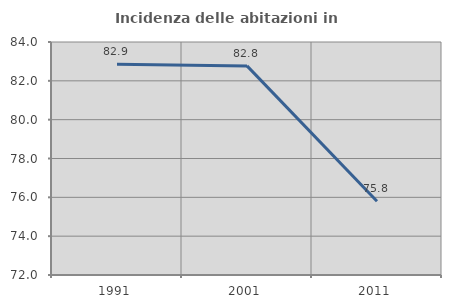
| Category | Incidenza delle abitazioni in proprietà  |
|---|---|
| 1991.0 | 82.857 |
| 2001.0 | 82.769 |
| 2011.0 | 75.796 |